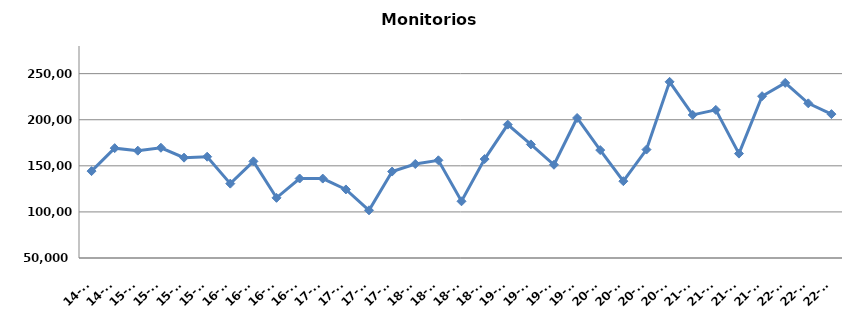
| Category | Monitorios ingresados |
|---|---|
| 14-T3 | 144262 |
| 14-T4 | 169174 |
| 15-T1 | 166433 |
| 15-T2 | 169612 |
| 15-T3 | 158859 |
| 15-T4 | 159890 |
| 16-T1 | 130680 |
| 16-T2 | 154860 |
| 16-T3 | 115269 |
| 16-T4 | 136245 |
| 17-T1 | 136155 |
| 17-T2 | 124382 |
| 17-T3 | 101751 |
| 17-T4 | 143788 |
| 18-T1 | 151974 |
| 18-T2 | 155991 |
| 18-T3 | 111544 |
| 18-T4 | 157337 |
| 19-T1 | 194715 |
| 19-T2 | 173225 |
| 19-T3 | 151156 |
| 19-T4 | 201895 |
| 20-T1 | 167095 |
| 20-T2 | 133351 |
| 20-T3 | 167630 |
| 20-T4 | 241119 |
| 21-T1 | 205212 |
| 21-T2 | 210679 |
| 21-T3 | 163259 |
| 21-T4 | 225536 |
| 22-T1 | 239972 |
| 22-T2 | 217801 |
| 22-T3 | 206093 |